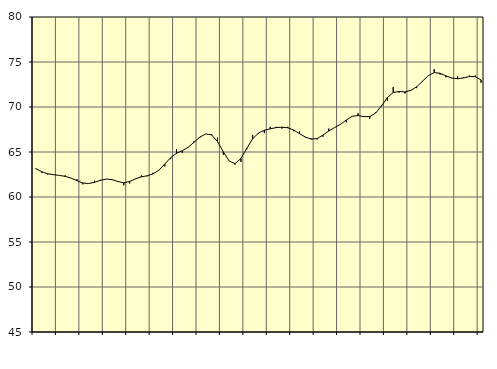
| Category | Piggar | Samtliga anställda (inkl. anställda utomlands) |
|---|---|---|
| nan | 63.2 | 63.14 |
| 1.0 | 62.7 | 62.8 |
| 1.0 | 62.5 | 62.58 |
| 1.0 | 62.5 | 62.48 |
| nan | 62.4 | 62.4 |
| 2.0 | 62.4 | 62.29 |
| 2.0 | 62.1 | 62.1 |
| 2.0 | 62 | 61.81 |
| nan | 61.4 | 61.56 |
| 3.0 | 61.5 | 61.5 |
| 3.0 | 61.8 | 61.63 |
| 3.0 | 61.9 | 61.85 |
| nan | 62 | 61.99 |
| 4.0 | 61.9 | 61.93 |
| 4.0 | 61.7 | 61.72 |
| 4.0 | 61.3 | 61.58 |
| nan | 61.5 | 61.73 |
| 5.0 | 62 | 62.02 |
| 5.0 | 62.4 | 62.24 |
| 5.0 | 62.3 | 62.36 |
| nan | 62.7 | 62.57 |
| 6.0 | 63 | 62.98 |
| 6.0 | 63.4 | 63.66 |
| 6.0 | 64.2 | 64.37 |
| nan | 65.3 | 64.86 |
| 7.0 | 64.9 | 65.15 |
| 7.0 | 65.5 | 65.53 |
| 7.0 | 66.2 | 66.09 |
| nan | 66.6 | 66.66 |
| 8.0 | 67 | 67.01 |
| 8.0 | 67 | 66.9 |
| 8.0 | 66.6 | 66.15 |
| nan | 64.7 | 65.02 |
| 9.0 | 64 | 64 |
| 9.0 | 63.6 | 63.71 |
| 9.0 | 63.9 | 64.28 |
| nan | 65.3 | 65.4 |
| 10.0 | 66.9 | 66.47 |
| 10.0 | 67 | 67.11 |
| 10.0 | 67.1 | 67.42 |
| nan | 67.8 | 67.57 |
| 11.0 | 67.8 | 67.71 |
| 11.0 | 67.6 | 67.76 |
| 11.0 | 67.8 | 67.69 |
| nan | 67.3 | 67.44 |
| 12.0 | 67.3 | 67.03 |
| 12.0 | 66.6 | 66.66 |
| 12.0 | 66.5 | 66.43 |
| nan | 66.4 | 66.49 |
| 13.0 | 66.7 | 66.88 |
| 13.0 | 67.6 | 67.34 |
| 13.0 | 67.7 | 67.72 |
| nan | 68.1 | 68.08 |
| 14.0 | 68.3 | 68.56 |
| 14.0 | 69 | 68.97 |
| 14.0 | 69.3 | 69.05 |
| nan | 68.9 | 68.93 |
| 15.0 | 68.7 | 68.94 |
| 15.0 | 69.4 | 69.33 |
| 15.0 | 70.2 | 70.12 |
| nan | 70.7 | 71.05 |
| 16.0 | 72.2 | 71.61 |
| 16.0 | 71.6 | 71.72 |
| 16.0 | 71.5 | 71.68 |
| nan | 71.8 | 71.84 |
| 17.0 | 72.1 | 72.25 |
| 17.0 | 72.8 | 72.86 |
| 17.0 | 73.5 | 73.49 |
| nan | 74.2 | 73.82 |
| 18.0 | 73.6 | 73.75 |
| 18.0 | 73.3 | 73.46 |
| 18.0 | 73.2 | 73.22 |
| nan | 73.4 | 73.14 |
| 19.0 | 73.3 | 73.23 |
| 19.0 | 73.5 | 73.38 |
| 19.0 | 73.5 | 73.37 |
| nan | 72.7 | 73.01 |